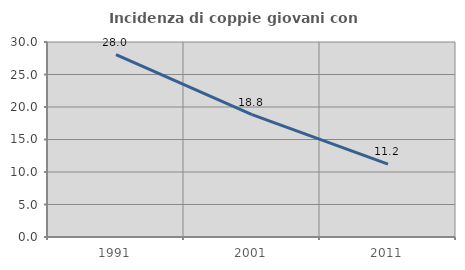
| Category | Incidenza di coppie giovani con figli |
|---|---|
| 1991.0 | 28.042 |
| 2001.0 | 18.838 |
| 2011.0 | 11.215 |